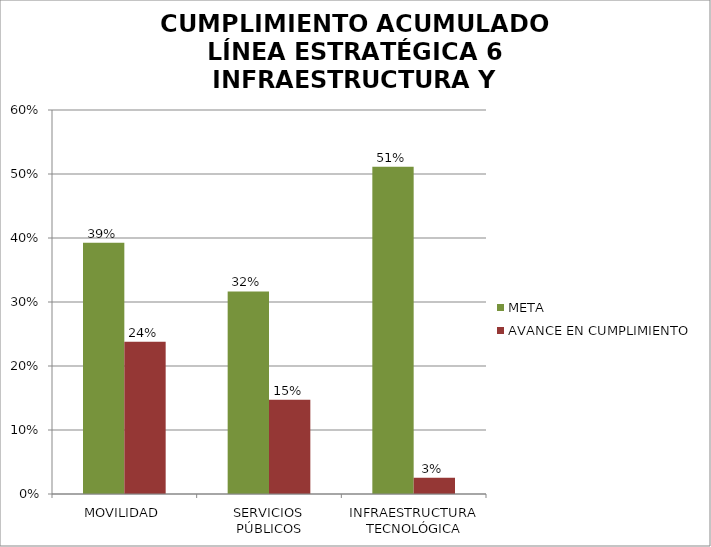
| Category | META | AVANCE EN CUMPLIMIENTO |
|---|---|---|
| MOVILIDAD | 0.392 | 0.238 |
| SERVICIOS PÚBLICOS | 0.316 | 0.147 |
| INFRAESTRUCTURA TECNOLÓGICA | 0.511 | 0.025 |